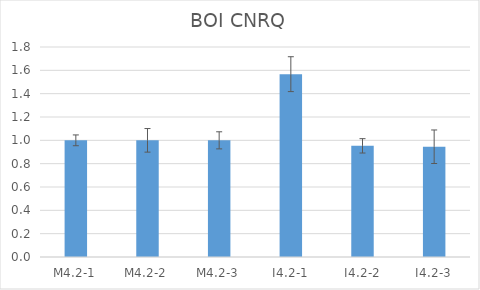
| Category | BOI CNRQ |
|---|---|
| M4.2-1 | 1 |
| M4.2-2 | 1 |
| M4.2-3 | 1 |
| I4.2-1 | 1.567 |
| I4.2-2 | 0.953 |
| I4.2-3 | 0.945 |